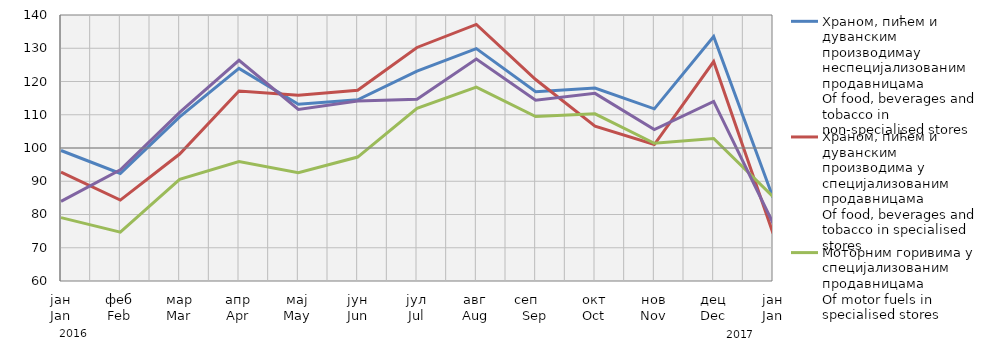
| Category | Храном, пићем и дуванским производимау неспецијализованим продавницама
Of food, beverages and tobacco in non-specialised stores
 | Храном, пићем и дуванским производима у специјализовaним продавницама
Of food, beverages and tobacco in specialised stores | Моторним горивима у специјализованим продавницама
Of motor fuels in specialised stores | Остала
Other |
|---|---|---|---|---|
| јан
Jan | 99.255 | 92.722 | 79.068 | 83.94 |
| феб
Feb | 92.363 | 84.339 | 74.7 | 93.451 |
| мар
Mar | 109.349 | 98.183 | 90.564 | 110.695 |
| апр
Apr | 123.935 | 117.147 | 95.897 | 126.373 |
| мај
May | 113.15 | 115.884 | 92.592 | 111.621 |
| јун
Jun | 114.503 | 117.373 | 97.274 | 114.134 |
| јул
Jul | 123.119 | 130.235 | 111.897 | 114.647 |
| авг
Aug | 129.897 | 137.173 | 118.321 | 126.728 |
| сеп     Sep | 116.954 | 120.599 | 109.459 | 114.395 |
| окт
Oct | 118.057 | 106.539 | 110.286 | 116.429 |
| нов
Nov | 111.772 | 101.038 | 101.435 | 105.563 |
| дец
Dec | 133.518 | 125.992 | 102.88 | 114.01 |
| јан
Jan | 85.099 | 74.328 | 85.371 | 77.452 |